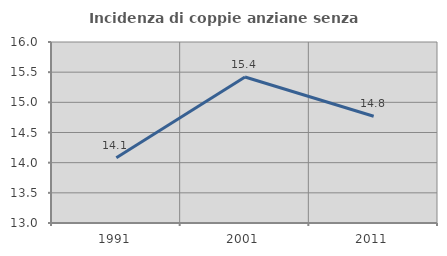
| Category | Incidenza di coppie anziane senza figli  |
|---|---|
| 1991.0 | 14.082 |
| 2001.0 | 15.421 |
| 2011.0 | 14.77 |